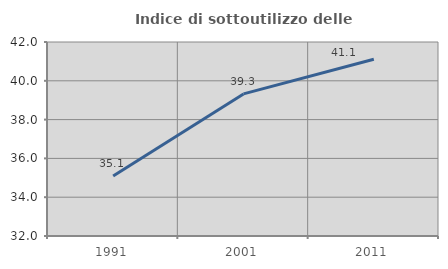
| Category | Indice di sottoutilizzo delle abitazioni  |
|---|---|
| 1991.0 | 35.09 |
| 2001.0 | 39.324 |
| 2011.0 | 41.111 |